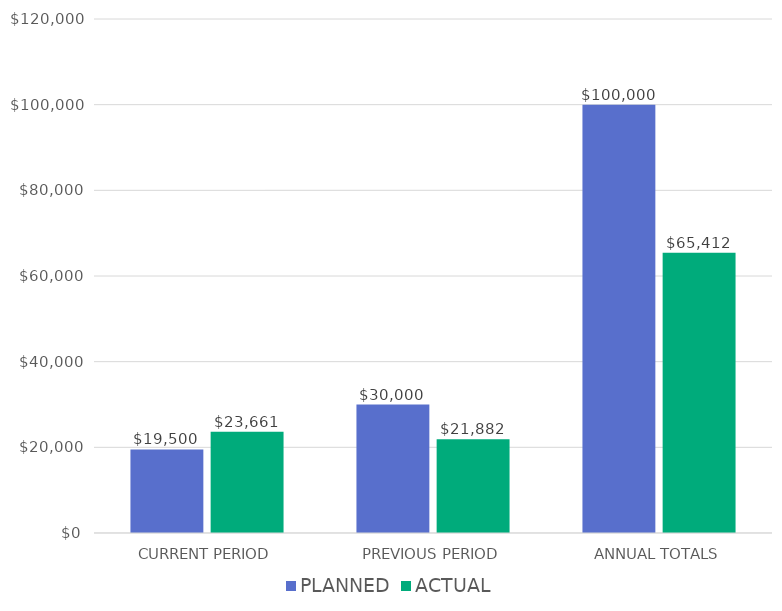
| Category | PLANNED | ACTUAL |
|---|---|---|
| CURRENT PERIOD | 19500 | 23661 |
| PREVIOUS PERIOD | 30000 | 21882 |
| ANNUAL TOTALS | 100000 | 65412 |